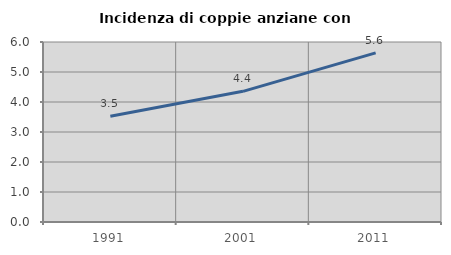
| Category | Incidenza di coppie anziane con figli |
|---|---|
| 1991.0 | 3.526 |
| 2001.0 | 4.356 |
| 2011.0 | 5.639 |